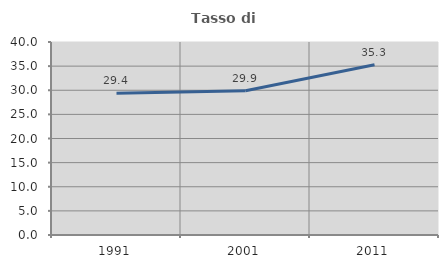
| Category | Tasso di occupazione   |
|---|---|
| 1991.0 | 29.372 |
| 2001.0 | 29.899 |
| 2011.0 | 35.28 |